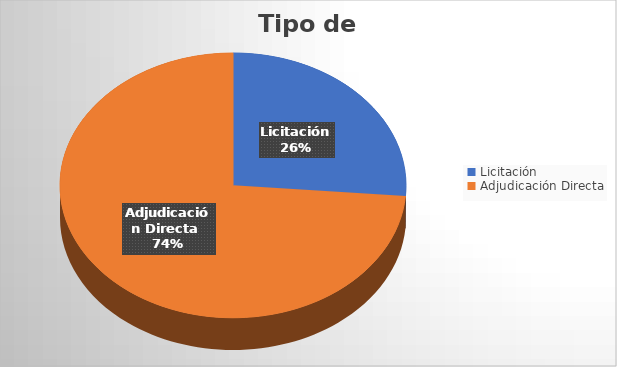
| Category | Monto  |
|---|---|
| Licitación  | 17695474.4 |
| Adjudicación Directa  | 49644536 |